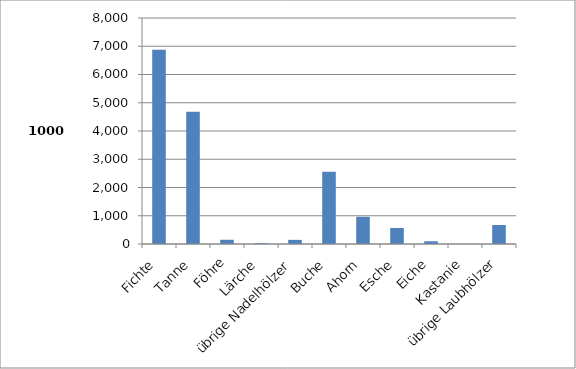
| Category | Total |
|---|---|
| Fichte | 6875.3 |
| Tanne | 4684.6 |
| Föhre | 150 |
| Lärche | 25.6 |
| übrige Nadelhölzer | 146.2 |
| Buche | 2556.8 |
| Ahorn | 962.8 |
| Esche | 566.2 |
| Eiche | 96.7 |
| Kastanie | 3.8 |
| übrige Laubhölzer | 673.5 |